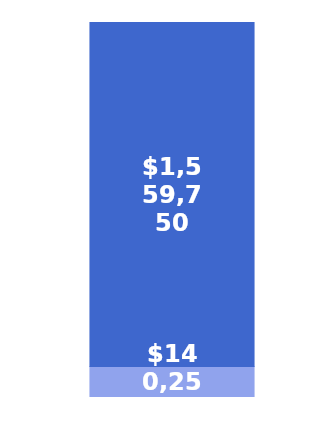
| Category | Balance | Total Startup Costs |
|---|---|---|
| 0 | 140250 | 1559750 |